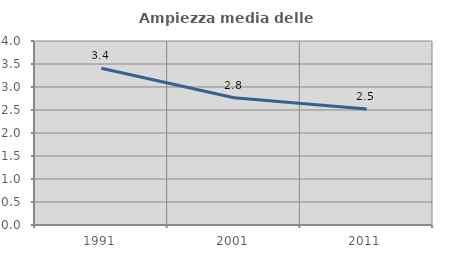
| Category | Ampiezza media delle famiglie |
|---|---|
| 1991.0 | 3.409 |
| 2001.0 | 2.768 |
| 2011.0 | 2.521 |